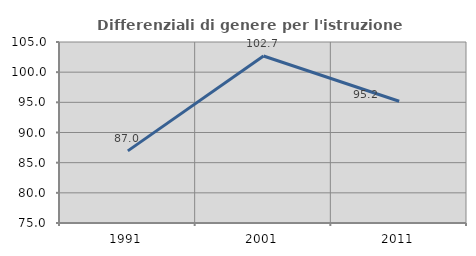
| Category | Differenziali di genere per l'istruzione superiore |
|---|---|
| 1991.0 | 86.951 |
| 2001.0 | 102.676 |
| 2011.0 | 95.182 |